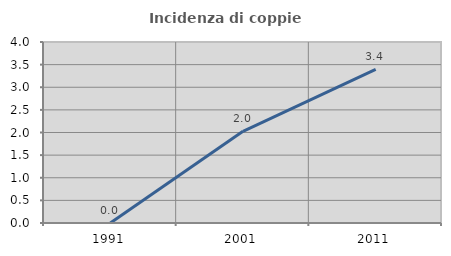
| Category | Incidenza di coppie miste |
|---|---|
| 1991.0 | 0 |
| 2001.0 | 2.026 |
| 2011.0 | 3.393 |